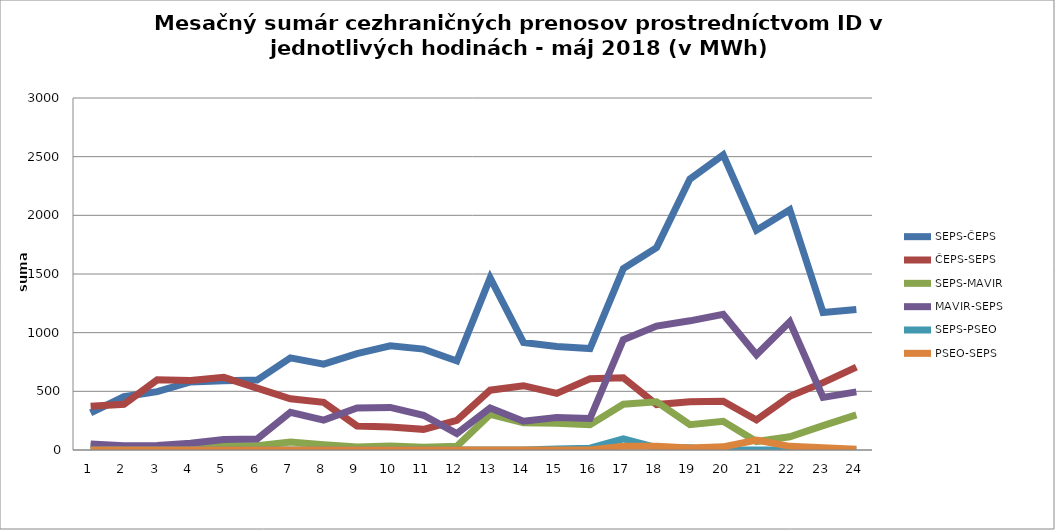
| Category | SEPS-ČEPS | ČEPS-SEPS | SEPS-MAVIR | MAVIR-SEPS | SEPS-PSEO | PSEO-SEPS |
|---|---|---|---|---|---|---|
| 1.0 | 316 | 372 | 30 | 52 | 0 | 0 |
| 2.0 | 454 | 389 | 29 | 36 | 0 | 0 |
| 3.0 | 497 | 598 | 30 | 39 | 0 | 0 |
| 4.0 | 580 | 592 | 32 | 57 | 0 | 0 |
| 5.0 | 591 | 619 | 37 | 89 | 0 | 0 |
| 6.0 | 596 | 527 | 37 | 94 | 0 | 0 |
| 7.0 | 785 | 436 | 68 | 321 | 0 | 0 |
| 8.0 | 732 | 406 | 45 | 255 | 0 | 0 |
| 9.0 | 821 | 205 | 25 | 358 | 0 | 0 |
| 10.0 | 888 | 196 | 34 | 363 | 0 | 0 |
| 11.0 | 860 | 176 | 24 | 296 | 0 | 0 |
| 12.0 | 759 | 252 | 32 | 140 | 0 | 0 |
| 13.0 | 1466 | 510 | 303 | 359 | 0 | 0 |
| 14.0 | 917 | 548 | 233 | 246 | 0 | 0 |
| 15.0 | 883 | 482 | 228 | 276 | 8 | 0 |
| 16.0 | 865 | 607 | 216 | 268 | 15 | 0 |
| 17.0 | 1546 | 615 | 390 | 940 | 94 | 33 |
| 18.0 | 1725 | 387 | 411 | 1056 | 20 | 32 |
| 19.0 | 2309 | 411 | 216 | 1101 | 20 | 17 |
| 20.0 | 2515 | 415 | 244 | 1157 | 0 | 27 |
| 21.0 | 1874 | 256 | 72 | 811 | 0 | 84 |
| 22.0 | 2048 | 457 | 113 | 1093 | 0 | 31 |
| 23.0 | 1172 | 574 | 208 | 448 | 0 | 20 |
| 24.0 | 1197 | 706 | 299 | 495 | 0 | 7 |